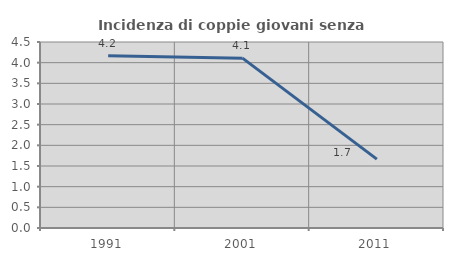
| Category | Incidenza di coppie giovani senza figli |
|---|---|
| 1991.0 | 4.167 |
| 2001.0 | 4.11 |
| 2011.0 | 1.667 |